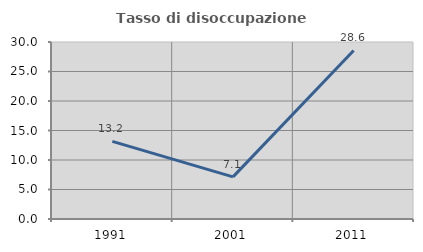
| Category | Tasso di disoccupazione giovanile  |
|---|---|
| 1991.0 | 13.158 |
| 2001.0 | 7.143 |
| 2011.0 | 28.571 |